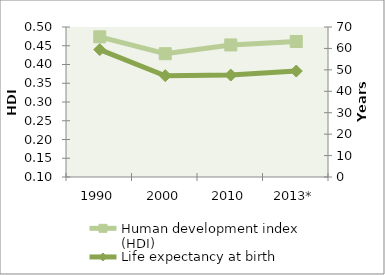
| Category | Human development index (HDI) |
|---|---|
| 1990 | 0.474 |
| 2000 | 0.429 |
| 2010 | 0.452 |
| 2013* | 0.461 |